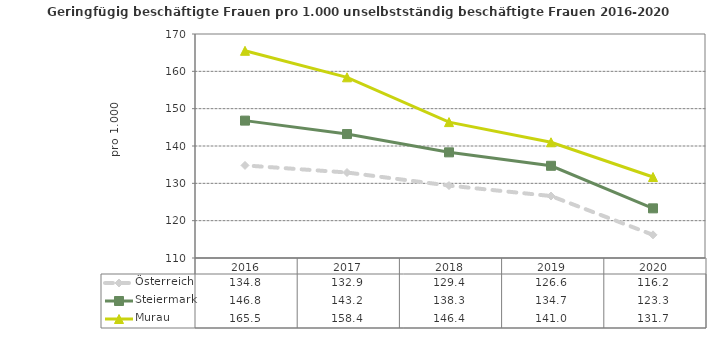
| Category | Österreich | Steiermark | Murau |
|---|---|---|---|
| 2020.0 | 116.2 | 123.3 | 131.7 |
| 2019.0 | 126.6 | 134.7 | 141 |
| 2018.0 | 129.4 | 138.3 | 146.4 |
| 2017.0 | 132.9 | 143.2 | 158.4 |
| 2016.0 | 134.8 | 146.8 | 165.5 |